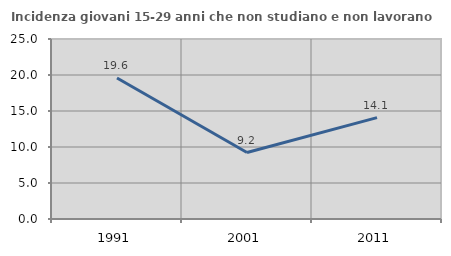
| Category | Incidenza giovani 15-29 anni che non studiano e non lavorano  |
|---|---|
| 1991.0 | 19.588 |
| 2001.0 | 9.236 |
| 2011.0 | 14.073 |